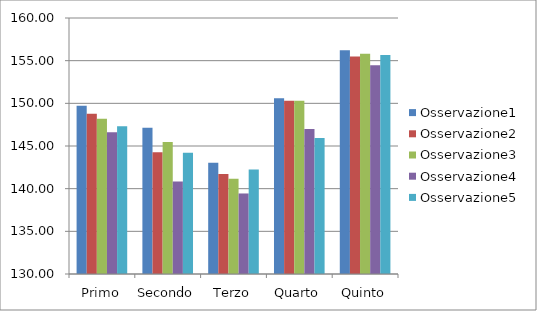
| Category | Osservazione1 | Osservazione2 | Osservazione3 | Osservazione4 | Osservazione5 |
|---|---|---|---|---|---|
| Primo | 149.703 | 148.788 | 148.193 | 146.615 | 147.324 |
| Secondo | 147.134 | 144.262 | 145.455 | 140.85 | 144.198 |
| Terzo | 143.046 | 141.725 | 141.176 | 139.437 | 142.235 |
| Quarto | 150.595 | 150.302 | 150.299 | 146.988 | 145.938 |
| Quinto | 156.233 | 155.495 | 155.817 | 154.457 | 155.669 |